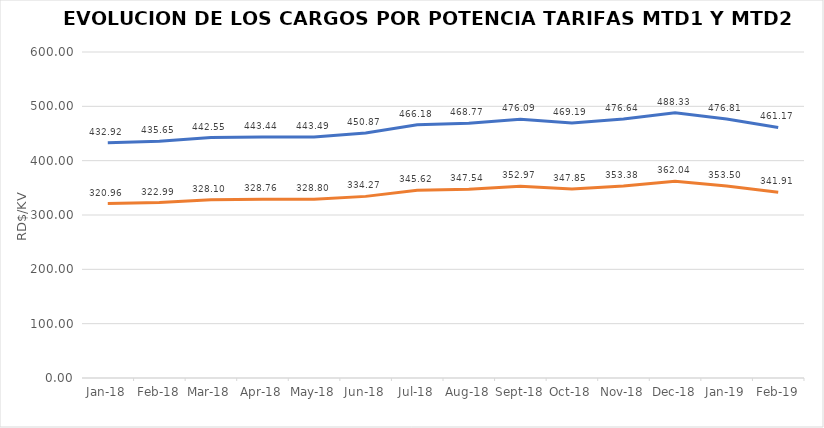
| Category | Series 0 | Series 1 |
|---|---|---|
| 2018-01-01 | 432.921 | 320.963 |
| 2018-02-01 | 435.65 | 322.99 |
| 2018-03-01 | 442.548 | 328.1 |
| 2018-04-01 | 443.441 | 328.763 |
| 2018-05-01 | 443.49 | 328.8 |
| 2018-06-01 | 450.875 | 334.273 |
| 2018-07-01 | 466.183 | 345.623 |
| 2018-08-01 | 468.773 | 347.543 |
| 2018-09-01 | 476.093 | 352.97 |
| 2018-10-01 | 469.192 | 347.854 |
| 2018-11-01 | 476.64 | 353.38 |
| 2018-12-01 | 488.33 | 362.04 |
| 2019-01-01 | 476.807 | 353.5 |
| 2019-02-01 | 461.172 | 341.908 |